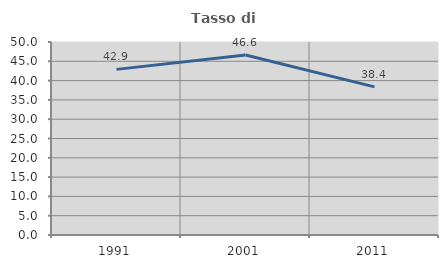
| Category | Tasso di occupazione   |
|---|---|
| 1991.0 | 42.91 |
| 2001.0 | 46.626 |
| 2011.0 | 38.372 |